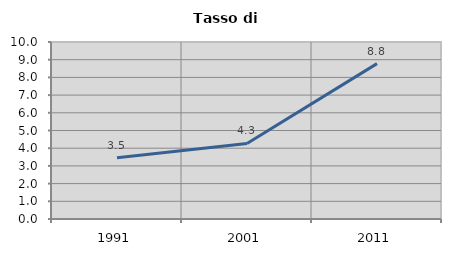
| Category | Tasso di disoccupazione   |
|---|---|
| 1991.0 | 3.462 |
| 2001.0 | 4.267 |
| 2011.0 | 8.779 |